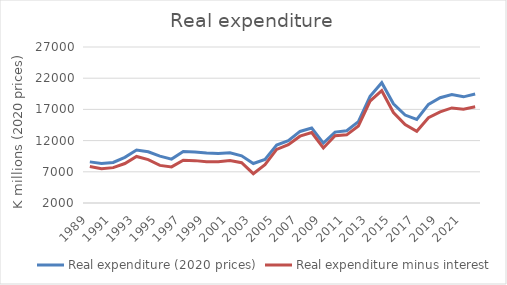
| Category | Real expenditure (2020 prices) | Real expenditure minus interest |
|---|---|---|
| 1989.0 | 8590.606 | 7846.267 |
| 1990.0 | 8338.381 | 7506.916 |
| 1991.0 | 8501.812 | 7667.951 |
| 1992.0 | 9320.473 | 8325.502 |
| 1993.0 | 10492.104 | 9456.686 |
| 1994.0 | 10203.61 | 8960.492 |
| 1995.0 | 9510.273 | 8030.356 |
| 1996.0 | 9032.893 | 7784.851 |
| 1997.0 | 10237.929 | 8848.089 |
| 1998.0 | 10176.587 | 8790.216 |
| 1999.0 | 10020.987 | 8616.196 |
| 2000.0 | 9921.987 | 8595.631 |
| 2001.0 | 10035.75 | 8809.668 |
| 2002.0 | 9559.898 | 8454.573 |
| 2003.0 | 8333.39 | 6700.448 |
| 2004.0 | 8967.782 | 8152.686 |
| 2005.0 | 11294.304 | 10587.654 |
| 2006.0 | 11980.109 | 11343.333 |
| 2007.0 | 13468.23 | 12707.502 |
| 2008.0 | 14009.442 | 13302.459 |
| 2009.0 | 11603.37 | 10823.936 |
| 2010.0 | 13360.322 | 12777.379 |
| 2011.0 | 13576.578 | 12918.52 |
| 2012.0 | 15035.517 | 14351.582 |
| 2013.0 | 19094.887 | 18339.688 |
| 2014.0 | 21285.153 | 19999.981 |
| 2015.0 | 17890.533 | 16494.119 |
| 2016.0 | 16097 | 14557.383 |
| 2017.0 | 15389.336 | 13501.572 |
| 2018.0 | 17804.219 | 15669.262 |
| 2019.0 | 18870.092 | 16600.502 |
| 2020.0 | 19397.8 | 17232.7 |
| 2021.0 | 19013.402 | 17044.517 |
| 2022.0 | 19459.158 | 17419.416 |